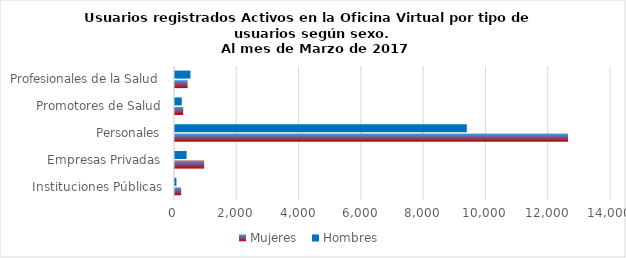
| Category | Mujeres | Hombres |
|---|---|---|
| Instituciones Públicas | 197 | 46 |
| Empresas Privadas | 935 | 372 |
| Personales | 12621 | 9370 |
| Promotores de Salud | 264 | 216 |
| Profesionales de la Salud | 405 | 495 |